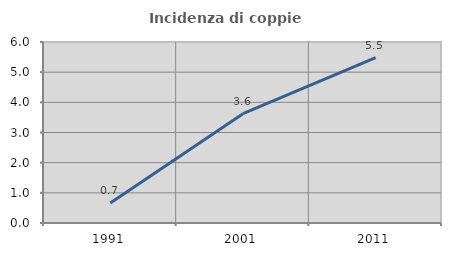
| Category | Incidenza di coppie miste |
|---|---|
| 1991.0 | 0.662 |
| 2001.0 | 3.623 |
| 2011.0 | 5.479 |